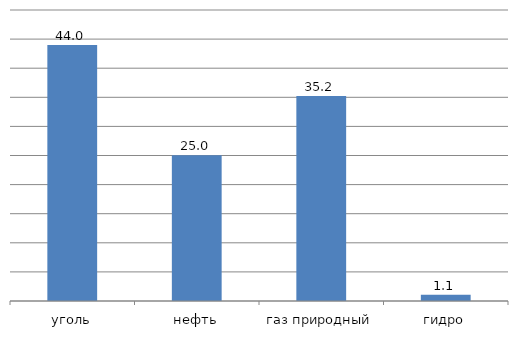
| Category | Series 0 |
|---|---|
| уголь | 43.989 |
| нефть | 25.026 |
| газ природный | 35.221 |
| гидро | 1.069 |